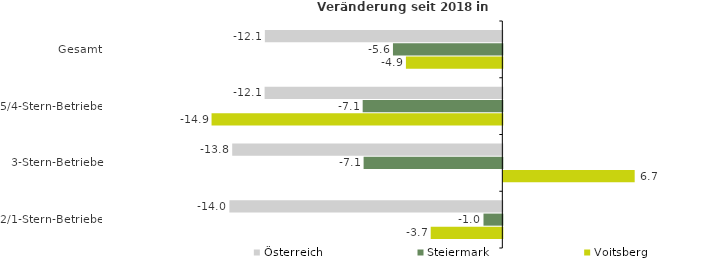
| Category | Österreich | Steiermark | Voitsberg |
|---|---|---|---|
| Gesamt | -12.137 | -5.59 | -4.927 |
| 5/4-Stern-Betriebe | -12.15 | -7.138 | -14.861 |
| 3-Stern-Betriebe | -13.805 | -7.09 | 6.713 |
| 2/1-Stern-Betriebe | -13.951 | -0.963 | -3.66 |